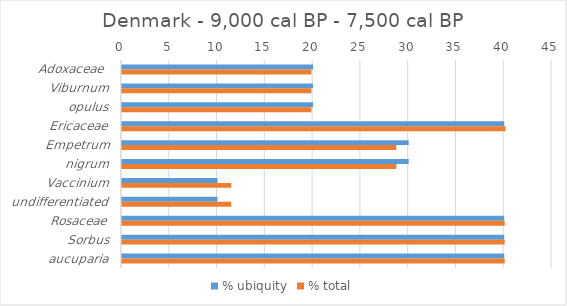
| Category | % ubiquity | % total |
|---|---|---|
| Adoxaceae  | 20 | 19.814 |
| Viburnum | 20 | 19.814 |
| opulus | 20 | 19.814 |
| Ericaceae | 40 | 40.139 |
| Empetrum | 30 | 28.709 |
| nigrum | 30 | 28.709 |
| Vaccinium | 10 | 11.43 |
| undifferentiated | 10 | 11.43 |
| Rosaceae | 40 | 40.048 |
| Sorbus | 40 | 40.048 |
| aucuparia | 40 | 40.048 |